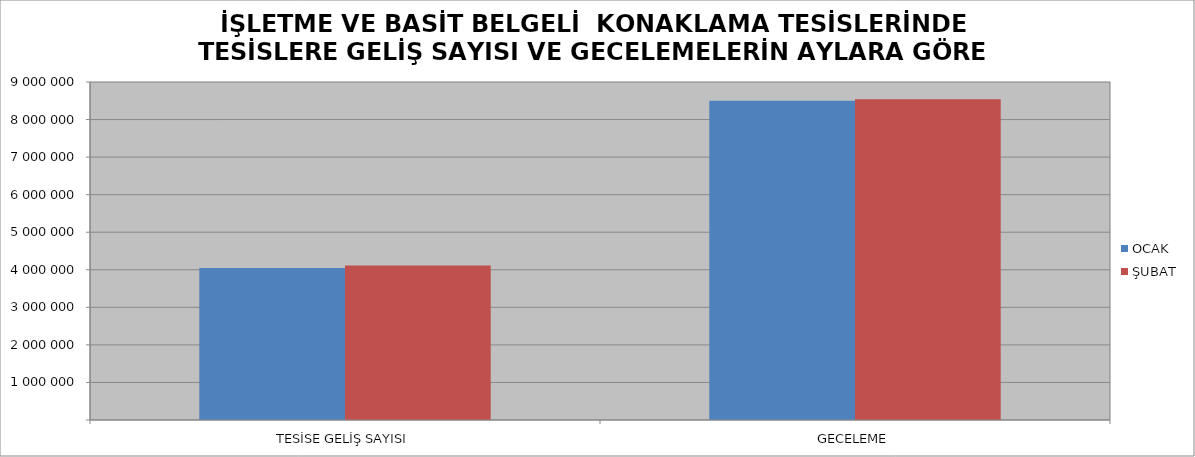
| Category | OCAK | ŞUBAT |
|---|---|---|
| TESİSE GELİŞ SAYISI | 4047187 | 4115542 |
| GECELEME | 8502645 | 8543805 |